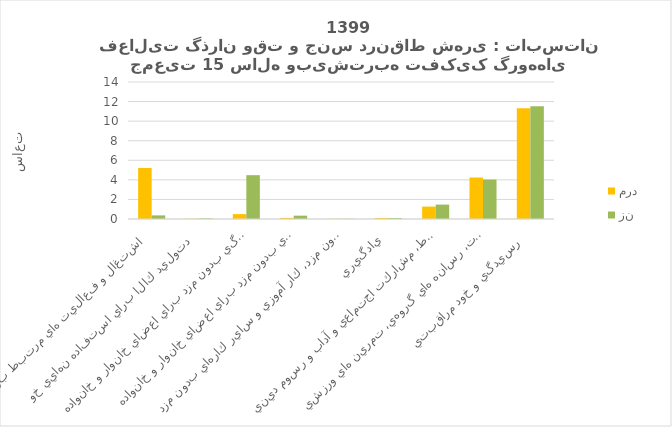
| Category | مرد | زن |
|---|---|---|
| اشتغال و فعاليت هاي مرتبط براي مزد  | 5.21 | 0.37 |
| توليد كالا براي استفاده نهايي خود   | 0.03 | 0.06 |
| خدمات خانگي بدون مزد براي اعضاي خانوار و خانواده   | 0.5 | 4.48 |
| خدمات مراقبتي بدون مزد براي اعضاي خانوار و خانواده   | 0.11 | 0.34 |
| كارداوطلبانه بدون مزد، كار آموزي و ساير كارهاي بدون مزد  | 0.02 | 0.02 |
| يادگيري  | 0.1 | 0.1 |
| معاشرت، ارتباط، مشاركت اجتماعي و آداب و رسوم ديني  | 1.27 | 1.47 |
| فرهنگ، فراغت، رسانه هاي گروهي، تمرين هاي ورزشي  | 4.24 | 4.03 |
| رسيدگي و خود مراقبتي   | 11.31 | 11.52 |